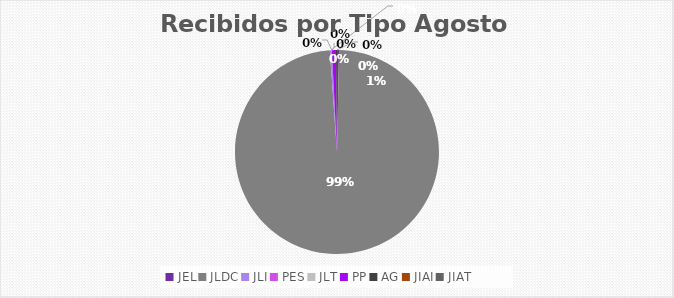
| Category | Series 0 |
|---|---|
| JEL | 2 |
| JLDC | 616 |
| JLI | 2 |
| PES | 0 |
| JLT | 0 |
| PP | 4 |
| AG | 1 |
| JIAI | 0 |
| JIAT | 0 |